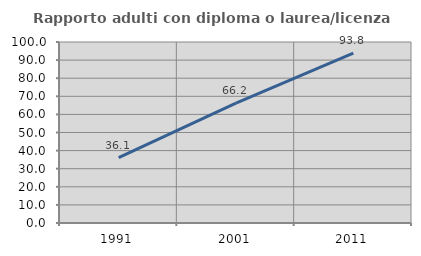
| Category | Rapporto adulti con diploma o laurea/licenza media  |
|---|---|
| 1991.0 | 36.111 |
| 2001.0 | 66.236 |
| 2011.0 | 93.793 |